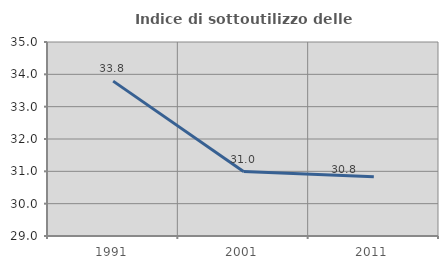
| Category | Indice di sottoutilizzo delle abitazioni  |
|---|---|
| 1991.0 | 33.79 |
| 2001.0 | 30.992 |
| 2011.0 | 30.833 |